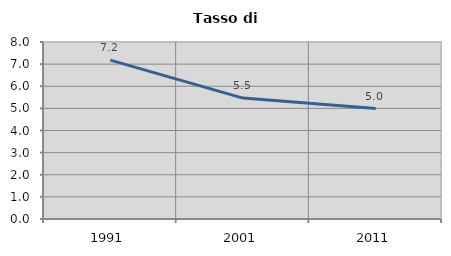
| Category | Tasso di disoccupazione   |
|---|---|
| 1991.0 | 7.179 |
| 2001.0 | 5.465 |
| 2011.0 | 4.994 |